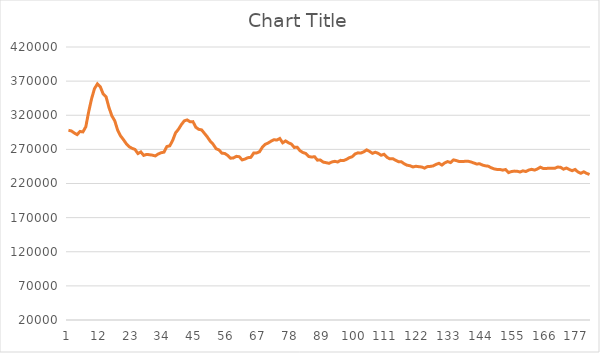
| Category | Series 0 |
|---|---|
| 0 | 297964.998 |
| 1 | 297012.06 |
| 2 | 294040.535 |
| 3 | 291604.831 |
| 4 | 296290.349 |
| 5 | 295606.906 |
| 6 | 303206.904 |
| 7 | 325331.27 |
| 8 | 344352.305 |
| 9 | 359026.06 |
| 10 | 365916.051 |
| 11 | 361746.52 |
| 12 | 351108.574 |
| 13 | 346934.266 |
| 14 | 331265.971 |
| 15 | 319104.1 |
| 16 | 311810.081 |
| 17 | 298048.905 |
| 18 | 289764.104 |
| 19 | 284246.057 |
| 20 | 278180.213 |
| 21 | 273760.758 |
| 22 | 271535.258 |
| 23 | 269875.906 |
| 24 | 263882.644 |
| 25 | 266226.644 |
| 26 | 261178.74 |
| 27 | 262648.972 |
| 28 | 262155.462 |
| 29 | 261490.604 |
| 30 | 260400.562 |
| 31 | 263198.457 |
| 32 | 265061.824 |
| 33 | 265908.636 |
| 34 | 274214.075 |
| 35 | 275185.517 |
| 36 | 283124.218 |
| 37 | 294235.881 |
| 38 | 299391.416 |
| 39 | 306247.781 |
| 40 | 311711.309 |
| 41 | 313130.222 |
| 42 | 310486.028 |
| 43 | 310646.66 |
| 44 | 302406.564 |
| 45 | 299383.21 |
| 46 | 298545.065 |
| 47 | 293338.007 |
| 48 | 288095.512 |
| 49 | 281828.005 |
| 50 | 277392.499 |
| 51 | 270961.186 |
| 52 | 269142.183 |
| 53 | 264449.834 |
| 54 | 263969.184 |
| 55 | 261131.985 |
| 56 | 257060.637 |
| 57 | 257486.172 |
| 58 | 259808.573 |
| 59 | 259220.579 |
| 60 | 254528.787 |
| 61 | 255899.715 |
| 62 | 257847.102 |
| 63 | 258298.933 |
| 64 | 264622.801 |
| 65 | 264748.24 |
| 66 | 266496.99 |
| 67 | 273270.248 |
| 68 | 277466.944 |
| 69 | 279364.12 |
| 70 | 282004.574 |
| 71 | 284170.132 |
| 72 | 283643.449 |
| 73 | 285946.246 |
| 74 | 279643.142 |
| 75 | 282428.951 |
| 76 | 279647.159 |
| 77 | 277856.252 |
| 78 | 272840.006 |
| 79 | 273205.341 |
| 80 | 267969.387 |
| 81 | 265373.79 |
| 82 | 263994.334 |
| 83 | 259570.84 |
| 84 | 258711.756 |
| 85 | 259285.532 |
| 86 | 254228.124 |
| 87 | 254470.18 |
| 88 | 251330.175 |
| 89 | 250548.198 |
| 90 | 249517.681 |
| 91 | 251579.78 |
| 92 | 252483.108 |
| 93 | 251543.777 |
| 94 | 253911.058 |
| 95 | 253555.058 |
| 96 | 255256.448 |
| 97 | 257785.886 |
| 98 | 259253.268 |
| 99 | 263284.186 |
| 100 | 264925.641 |
| 101 | 264597.251 |
| 102 | 266390.922 |
| 103 | 269215.967 |
| 104 | 267047.79 |
| 105 | 264191.667 |
| 106 | 265804.704 |
| 107 | 264177.3 |
| 108 | 261411.786 |
| 109 | 262766.62 |
| 110 | 258472.694 |
| 111 | 256101.123 |
| 112 | 256398.184 |
| 113 | 254070.145 |
| 114 | 251934.691 |
| 115 | 251852.404 |
| 116 | 248819.94 |
| 117 | 246782.747 |
| 118 | 246010.898 |
| 119 | 244240.208 |
| 120 | 245237.558 |
| 121 | 244623.56 |
| 122 | 244227.492 |
| 123 | 242529.003 |
| 124 | 244730.037 |
| 125 | 245079.106 |
| 126 | 245791.255 |
| 127 | 248040.572 |
| 128 | 249591.227 |
| 129 | 247000.426 |
| 130 | 250257.482 |
| 131 | 252131.002 |
| 132 | 250689.418 |
| 133 | 254589.247 |
| 134 | 253591.828 |
| 135 | 252208.925 |
| 136 | 252149.804 |
| 137 | 252500.094 |
| 138 | 252681.734 |
| 139 | 251576.829 |
| 140 | 250145.272 |
| 141 | 248547.806 |
| 142 | 248959.075 |
| 143 | 247034.25 |
| 144 | 245896.551 |
| 145 | 245376.12 |
| 146 | 243086.522 |
| 147 | 241444.456 |
| 148 | 240639.245 |
| 149 | 240638.172 |
| 150 | 239556.333 |
| 151 | 240506.766 |
| 152 | 235971.296 |
| 153 | 237454.826 |
| 154 | 238141.754 |
| 155 | 237952.22 |
| 156 | 236826.137 |
| 157 | 238543.383 |
| 158 | 237563.754 |
| 159 | 239743.953 |
| 160 | 240754.67 |
| 161 | 239630.84 |
| 162 | 241335.702 |
| 163 | 243906.66 |
| 164 | 241983.33 |
| 165 | 241950.03 |
| 166 | 242501.994 |
| 167 | 242251.126 |
| 168 | 242300.047 |
| 169 | 244146.303 |
| 170 | 243675.664 |
| 171 | 240986.144 |
| 172 | 242684.833 |
| 173 | 240498.409 |
| 174 | 238736.947 |
| 175 | 240605.024 |
| 176 | 236861.402 |
| 177 | 234958.872 |
| 178 | 237141.274 |
| 179 | 234842.936 |
| 180 | 233205.569 |